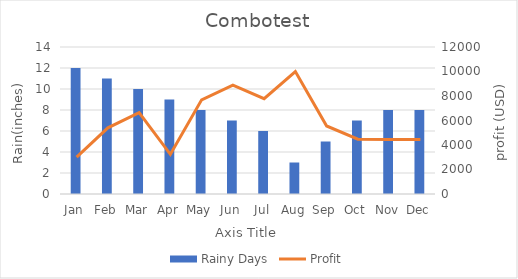
| Category | Rainy Days |
|---|---|
| Jan | 12 |
| Feb | 11 |
| Mar | 10 |
| Apr | 9 |
| May | 8 |
| Jun | 7 |
| Jul | 6 |
| Aug | 3 |
| Sep | 5 |
| Oct | 7 |
| Nov | 8 |
| Dec | 8 |